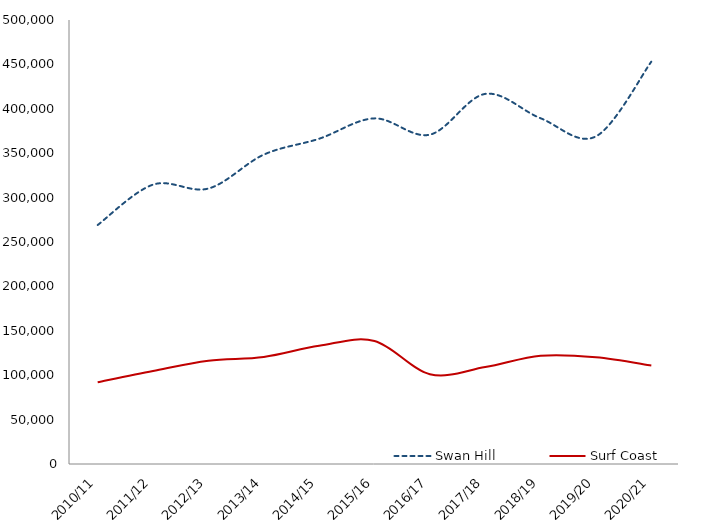
| Category | Swan Hill  | Surf Coast  |
|---|---|---|
| 2010/11 | 269150.056 | 92038.767 |
| 2011/12 | 314625.883 | 104752.012 |
| 2012/13 | 310203.437 | 116220.78 |
| 2013/14 | 348384.031 | 120519.952 |
| 2014/15 | 366285.804 | 133082.974 |
| 2015/16 | 389204.514 | 138555.681 |
| 2016/17 | 370846.394 | 101107.237 |
| 2017/18 | 416767.731 | 109138.599 |
| 2018/19 | 389358.902 | 121833.866 |
| 2019/20 | 368931.063 | 120209.416 |
| 2020/21 | 453082.004 | 110888.64 |